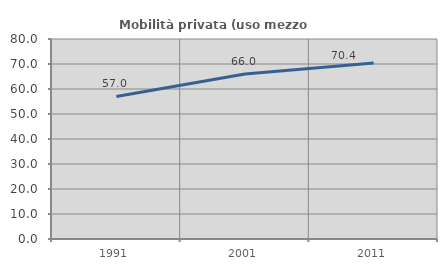
| Category | Mobilità privata (uso mezzo privato) |
|---|---|
| 1991.0 | 57.04 |
| 2001.0 | 66.019 |
| 2011.0 | 70.414 |